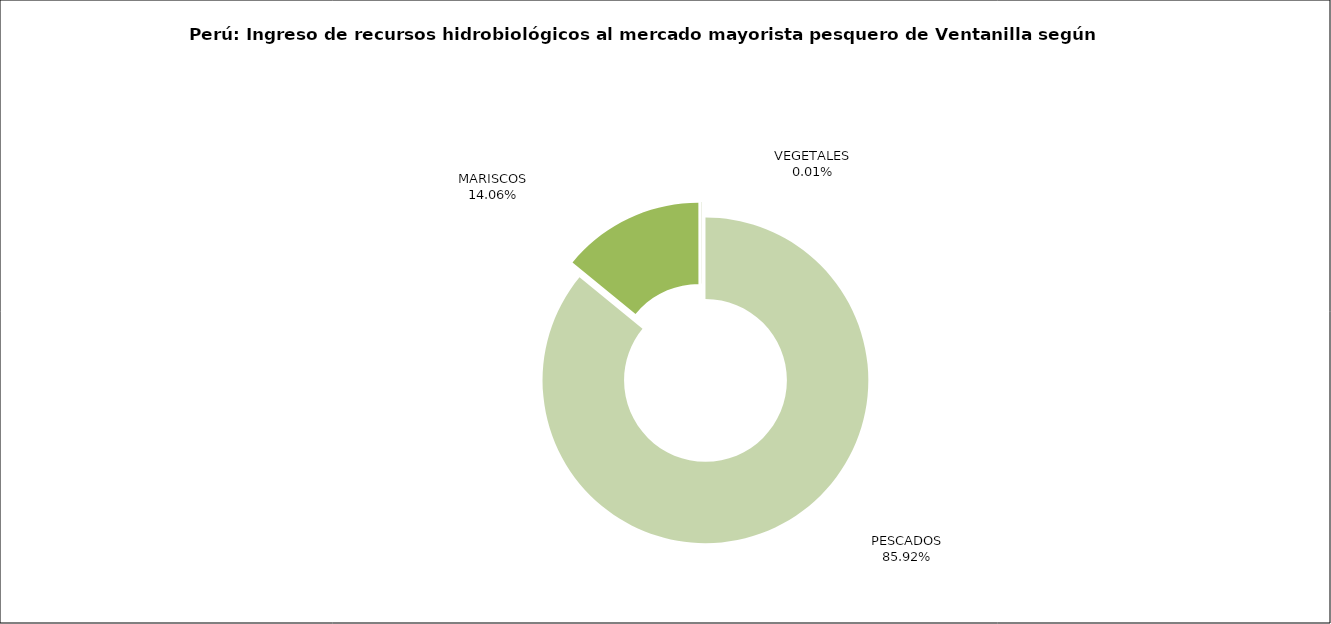
| Category | Series 0 |
|---|---|
| PESCADOS | 50581.651 |
| MARISCOS | 8277.922 |
| VEGETALES | 8.05 |